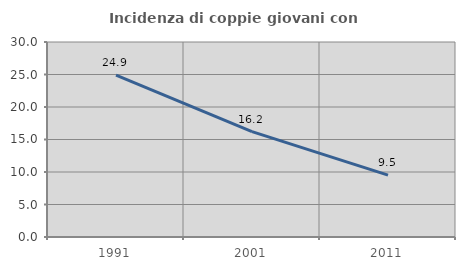
| Category | Incidenza di coppie giovani con figli |
|---|---|
| 1991.0 | 24.903 |
| 2001.0 | 16.212 |
| 2011.0 | 9.524 |